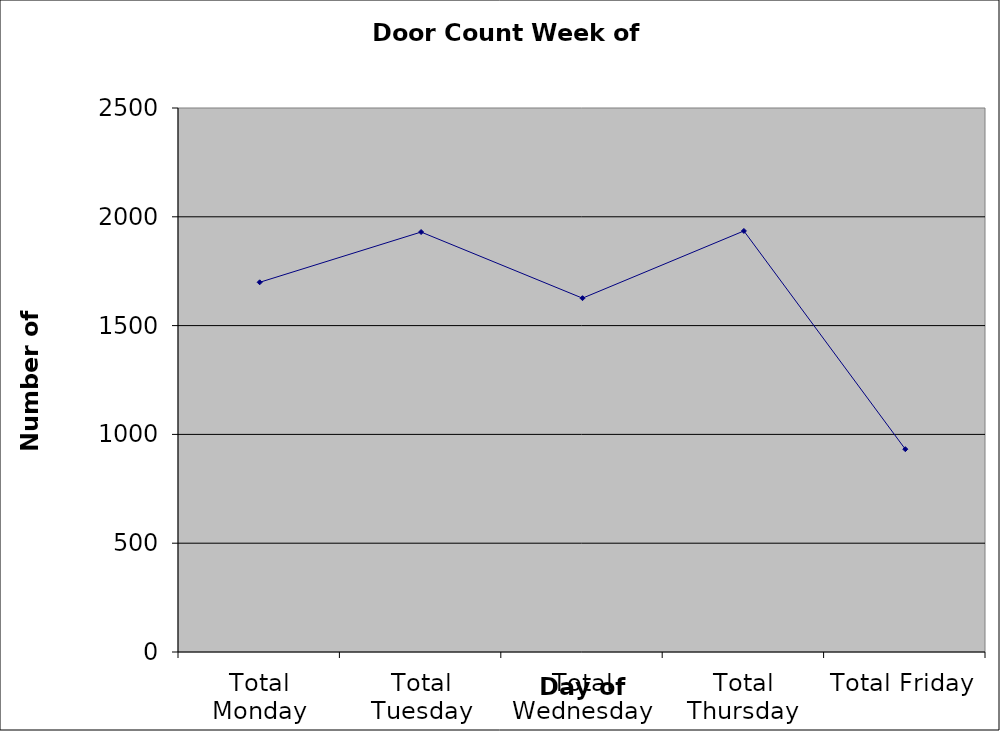
| Category | Series 0 |
|---|---|
| Total Monday | 1699 |
| Total Tuesday | 1930 |
| Total Wednesday | 1626 |
| Total Thursday | 1935 |
| Total Friday | 932 |